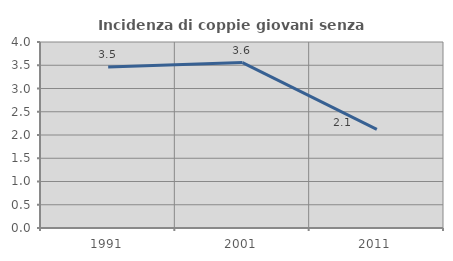
| Category | Incidenza di coppie giovani senza figli |
|---|---|
| 1991.0 | 3.464 |
| 2001.0 | 3.557 |
| 2011.0 | 2.122 |